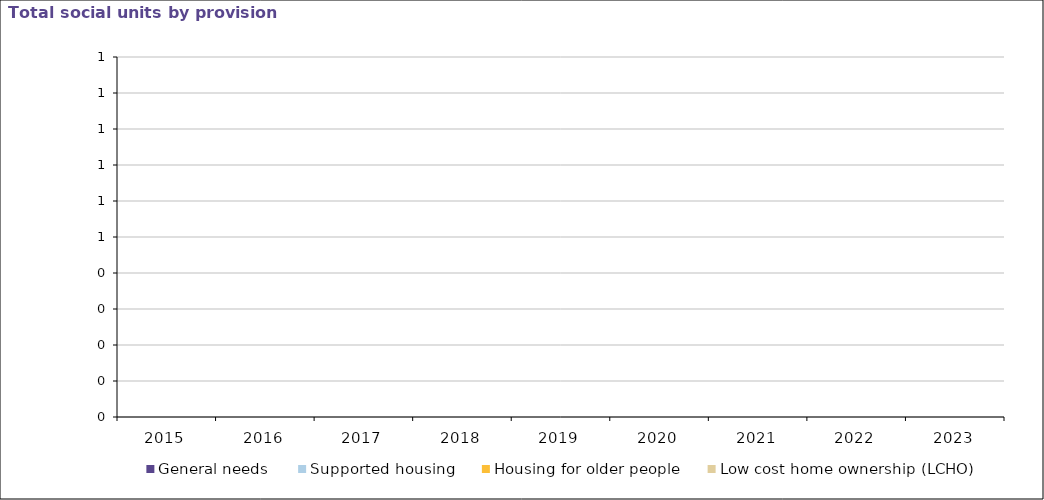
| Category | General needs | Supported housing | Housing for older people | Low cost home ownership (LCHO) |
|---|---|---|---|---|
| 2015.0 | 0 | 0 | 0 | 0 |
| 2016.0 | 0 | 0 | 0 | 0 |
| 2017.0 | 0 | 0 | 0 | 0 |
| 2018.0 | 0 | 0 | 0 | 0 |
| 2019.0 | 0 | 0 | 0 | 0 |
| 2020.0 | 0 | 0 | 0 | 0 |
| 2021.0 | 0 | 0 | 0 | 0 |
| 2022.0 | 0 | 0 | 0 | 0 |
| 2023.0 | 0 | 0 | 0 | 0 |